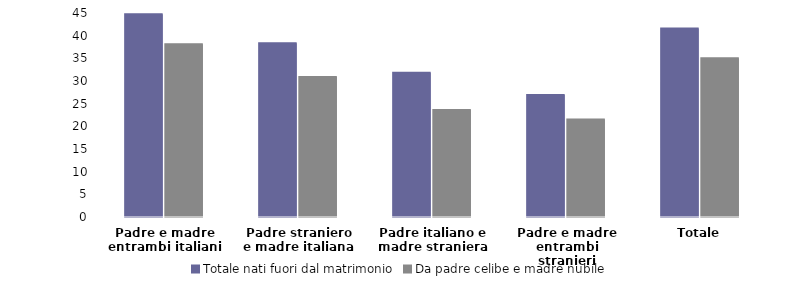
| Category | Totale nati fuori dal matrimonio | Da padre celibe e madre nubile |
|---|---|---|
| Padre e madre entrambi italiani | 44.7 | 38.1 |
| Padre straniero e madre italiana | 38.3 | 30.9 |
| Padre italiano e madre straniera | 31.8 | 23.6 |
| Padre e madre entrambi stranieri | 26.9 | 21.5 |
| Totale | 41.6 | 35 |